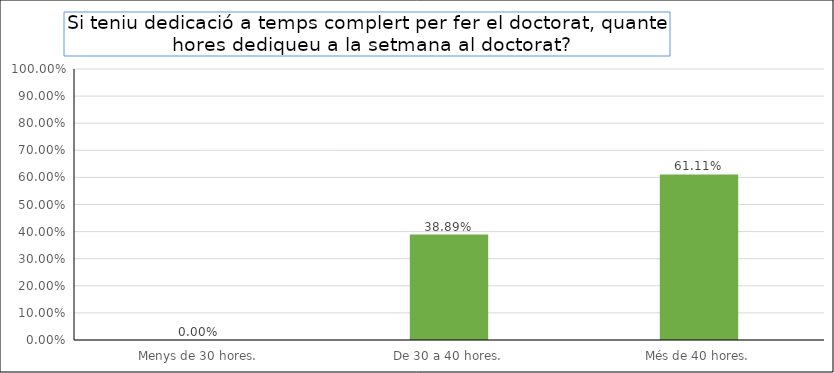
| Category | Series 0 |
|---|---|
| Menys de 30 hores. | 0 |
| De 30 a 40 hores. | 0.389 |
| Més de 40 hores. | 0.611 |